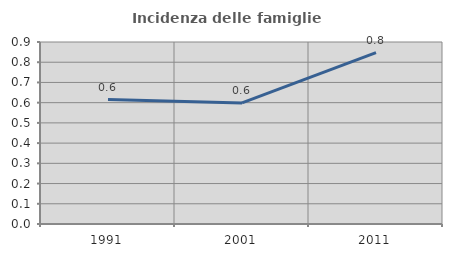
| Category | Incidenza delle famiglie numerose |
|---|---|
| 1991.0 | 0.615 |
| 2001.0 | 0.599 |
| 2011.0 | 0.847 |